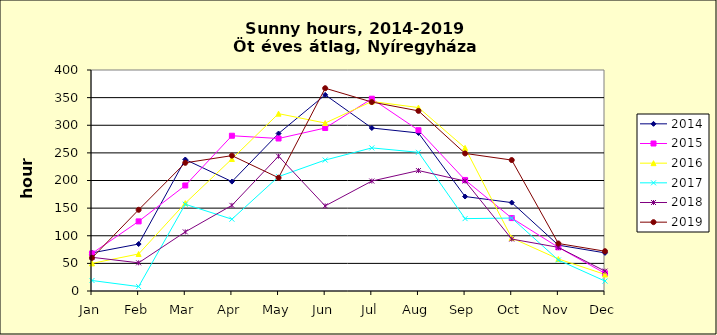
| Category | 2014 | 2015 | 2016 | 2017 | 2018 | 2019 |
|---|---|---|---|---|---|---|
| Jan | 69 | 68 | 50 | 19 | 61 | 60 |
| Feb | 85 | 126 | 67 | 8 | 51 | 147 |
| Mar | 238 | 191 | 159 | 157 | 107 | 232 |
| Apr | 198 | 281 | 239 | 130 | 155 | 245 |
| May | 285 | 276 | 321 | 207 | 244 | 205 |
| Jun | 355 | 295 | 304 | 237 | 154 | 367 |
| Jul | 295 | 348 | 343 | 259 | 199 | 342 |
| Aug | 286 | 291 | 332 | 251 | 218 | 326 |
| Sep | 171 | 201 | 259 | 131 | 199 | 249 |
| Oct | 160 | 132 | 96 | 132 | 94 | 237 |
| Nov | 83 | 79 | 58 | 56 | 79 | 86 |
| Dec | 69 | 32 | 30 | 18 | 36 | 72 |